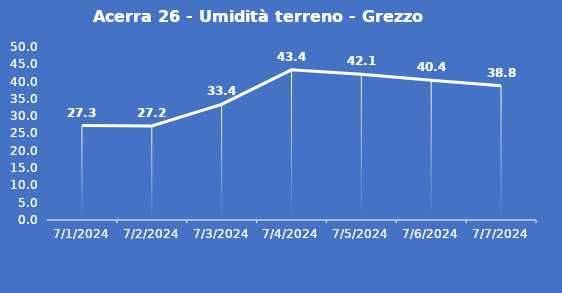
| Category | Acerra 26 - Umidità terreno - Grezzo (%VWC) |
|---|---|
| 7/1/24 | 27.3 |
| 7/2/24 | 27.2 |
| 7/3/24 | 33.4 |
| 7/4/24 | 43.4 |
| 7/5/24 | 42.1 |
| 7/6/24 | 40.4 |
| 7/7/24 | 38.8 |